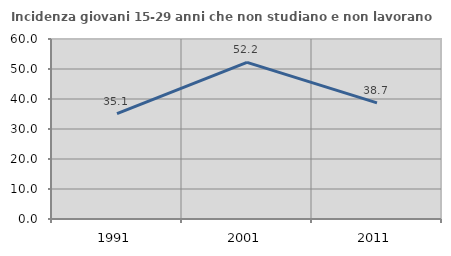
| Category | Incidenza giovani 15-29 anni che non studiano e non lavorano  |
|---|---|
| 1991.0 | 35.102 |
| 2001.0 | 52.196 |
| 2011.0 | 38.719 |